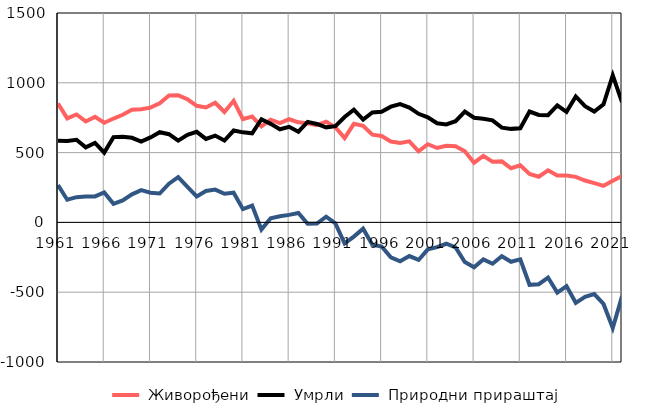
| Category |  Живорођени |  Умрли |  Природни прираштај |
|---|---|---|---|
| 1961.0 | 852 | 585 | 267 |
| 1962.0 | 745 | 583 | 162 |
| 1963.0 | 773 | 592 | 181 |
| 1964.0 | 723 | 538 | 185 |
| 1965.0 | 756 | 570 | 186 |
| 1966.0 | 714 | 500 | 214 |
| 1967.0 | 744 | 611 | 133 |
| 1968.0 | 771 | 613 | 158 |
| 1969.0 | 807 | 606 | 201 |
| 1970.0 | 810 | 579 | 231 |
| 1971.0 | 822 | 609 | 213 |
| 1972.0 | 853 | 646 | 207 |
| 1973.0 | 909 | 632 | 277 |
| 1974.0 | 910 | 586 | 324 |
| 1975.0 | 882 | 627 | 255 |
| 1976.0 | 835 | 649 | 186 |
| 1977.0 | 823 | 598 | 225 |
| 1978.0 | 857 | 622 | 235 |
| 1979.0 | 791 | 586 | 205 |
| 1980.0 | 871 | 658 | 213 |
| 1981.0 | 740 | 645 | 95 |
| 1982.0 | 758 | 638 | 120 |
| 1983.0 | 688 | 739 | -51 |
| 1984.0 | 736 | 706 | 30 |
| 1985.0 | 711 | 667 | 44 |
| 1986.0 | 739 | 685 | 54 |
| 1987.0 | 717 | 650 | 67 |
| 1988.0 | 710 | 720 | -10 |
| 1989.0 | 697 | 705 | -8 |
| 1990.0 | 722 | 681 | 41 |
| 1991.0 | 682 | 689 | -7 |
| 1992.0 | 604 | 755 | -151 |
| 1993.0 | 706 | 808 | -102 |
| 1994.0 | 692 | 737 | -45 |
| 1995.0 | 628 | 788 | -160 |
| 1996.0 | 619 | 792 | -173 |
| 1997.0 | 579 | 829 | -250 |
| 1998.0 | 569 | 848 | -279 |
| 1999.0 | 581 | 822 | -241 |
| 2000.0 | 509 | 778 | -269 |
| 2001.0 | 560 | 753 | -193 |
| 2002.0 | 533 | 710 | -177 |
| 2003.0 | 549 | 702 | -153 |
| 2004.0 | 546 | 725 | -179 |
| 2005.0 | 510 | 794 | -284 |
| 2006.0 | 428 | 750 | -322 |
| 2007.0 | 477 | 742 | -265 |
| 2008.0 | 435 | 731 | -296 |
| 2009.0 | 437 | 679 | -242 |
| 2010.0 | 388 | 670 | -282 |
| 2011.0 | 409 | 674 | -265 |
| 2012.0 | 347 | 794 | -447 |
| 2013.0 | 327 | 770 | -443 |
| 2014.0 | 373 | 768 | -395 |
| 2015.0 | 336 | 839 | -503 |
| 2016.0 | 336 | 792 | -456 |
| 2017.0 | 326 | 902 | -576 |
| 2018.0 | 300 | 833 | -533 |
| 2019.0 | 281 | 794 | -513 |
| 2020.0 | 262 | 846 | -584 |
| 2021.0 | 298 | 1054 | -756 |
| 2022.0 | 332 | 862 | -530 |